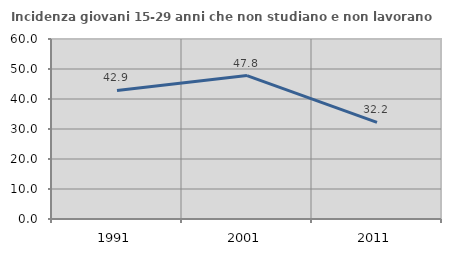
| Category | Incidenza giovani 15-29 anni che non studiano e non lavorano  |
|---|---|
| 1991.0 | 42.857 |
| 2001.0 | 47.809 |
| 2011.0 | 32.195 |